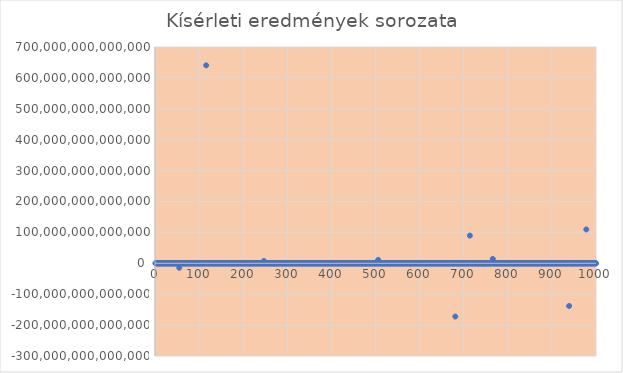
| Category | Series 0 |
|---|---|
| 1.0 | 73.342 |
| 2.0 | -17996149.542 |
| 3.0 | -966.237 |
| 4.0 | 42.602 |
| 5.0 | -108.548 |
| 6.0 | 33.973 |
| 7.0 | 140.555 |
| 8.0 | 71.246 |
| 9.0 | 44.869 |
| 10.0 | -35.589 |
| 11.0 | 1286.408 |
| 12.0 | 18496.876 |
| 13.0 | -331.157 |
| 14.0 | 5827.987 |
| 15.0 | 65.368 |
| 16.0 | -37.232 |
| 17.0 | 1768.149 |
| 18.0 | -10679392.451 |
| 19.0 | -5120.488 |
| 20.0 | 27354.216 |
| 21.0 | 3478.689 |
| 22.0 | -87.355 |
| 23.0 | -886.27 |
| 24.0 | -161.685 |
| 25.0 | 848.613 |
| 26.0 | 1270.61 |
| 27.0 | 44881.534 |
| 28.0 | 4924587.61 |
| 29.0 | 2750.919 |
| 30.0 | 37.906 |
| 31.0 | 869.395 |
| 32.0 | 513.963 |
| 33.0 | 309.55 |
| 34.0 | -81.606 |
| 35.0 | 9702.575 |
| 36.0 | 163.185 |
| 37.0 | 138.92 |
| 38.0 | -109.573 |
| 39.0 | 189.005 |
| 40.0 | 270.432 |
| 41.0 | -24876.986 |
| 42.0 | 24616.83 |
| 43.0 | 837.909 |
| 44.0 | -8648.032 |
| 45.0 | 1144230.685 |
| 46.0 | -347.863 |
| 47.0 | 3090.808 |
| 48.0 | 214.152 |
| 49.0 | -46.466 |
| 50.0 | 80198.546 |
| 51.0 | -2516649.224 |
| 52.0 | 262.194 |
| 53.0 | -143.619 |
| 54.0 | 260241145.39 |
| 55.0 | -14431486044279.479 |
| 56.0 | -308.086 |
| 57.0 | 2652790.462 |
| 58.0 | 56.416 |
| 59.0 | -49.711 |
| 60.0 | -439168.383 |
| 61.0 | 50229682.8 |
| 62.0 | -1007.143 |
| 63.0 | 278.02 |
| 64.0 | -41.912 |
| 65.0 | -34.911 |
| 66.0 | 281.714 |
| 67.0 | -2992721.788 |
| 68.0 | 19943122.994 |
| 69.0 | 1862.715 |
| 70.0 | -30557883.159 |
| 71.0 | -285.785 |
| 72.0 | 80.2 |
| 73.0 | -281.105 |
| 74.0 | -6490377.122 |
| 75.0 | 85.942 |
| 76.0 | -34.831 |
| 77.0 | 82.669 |
| 78.0 | -471415.258 |
| 79.0 | -485.772 |
| 80.0 | -75.779 |
| 81.0 | 44.763 |
| 82.0 | 271.97 |
| 83.0 | 44.031 |
| 84.0 | 72.902 |
| 85.0 | 56.182 |
| 86.0 | 238.183 |
| 87.0 | 2654.905 |
| 88.0 | 541023584.416 |
| 89.0 | 4011.777 |
| 90.0 | 3287.217 |
| 91.0 | -76.927 |
| 92.0 | -2416.525 |
| 93.0 | -80.453 |
| 94.0 | -30752041523.714 |
| 95.0 | -161.123 |
| 96.0 | -5057.578 |
| 97.0 | 56.502 |
| 98.0 | 227.156 |
| 99.0 | 4633.715 |
| 100.0 | -37.372 |
| 101.0 | 8231.867 |
| 102.0 | 100.859 |
| 103.0 | -100.55 |
| 104.0 | -69.773 |
| 105.0 | 128.622 |
| 106.0 | 298.721 |
| 107.0 | -10896.854 |
| 108.0 | 52.406 |
| 109.0 | -1121071.77 |
| 110.0 | 2136.982 |
| 111.0 | 151.973 |
| 112.0 | 3505.059 |
| 113.0 | -1383.465 |
| 114.0 | 3063.042 |
| 115.0 | -393.62 |
| 116.0 | 640627543377328 |
| 117.0 | 103.512 |
| 118.0 | 76179.574 |
| 119.0 | -6822.979 |
| 120.0 | -8134.371 |
| 121.0 | -402.621 |
| 122.0 | -112.778 |
| 123.0 | 476.123 |
| 124.0 | 16363.887 |
| 125.0 | 38.317 |
| 126.0 | 163.785 |
| 127.0 | -189543862.73 |
| 128.0 | -2467.603 |
| 129.0 | 45584441.06 |
| 130.0 | 10785528.859 |
| 131.0 | 81.131 |
| 132.0 | 4861.504 |
| 133.0 | -250.971 |
| 134.0 | -51.993 |
| 135.0 | 3661.877 |
| 136.0 | -71.236 |
| 137.0 | -40.481 |
| 138.0 | -36.744 |
| 139.0 | -3455.019 |
| 140.0 | -222.64 |
| 141.0 | 2890.851 |
| 142.0 | -405.697 |
| 143.0 | -121.586 |
| 144.0 | 242.682 |
| 145.0 | -1328.019 |
| 146.0 | -280.11 |
| 147.0 | -82.692 |
| 148.0 | -926.724 |
| 149.0 | -59200.779 |
| 150.0 | -300.909 |
| 151.0 | -167.935 |
| 152.0 | -59.829 |
| 153.0 | -52439.577 |
| 154.0 | 1104392375.133 |
| 155.0 | 314.073 |
| 156.0 | 134.134 |
| 157.0 | -57572.172 |
| 158.0 | 8915.127 |
| 159.0 | 365.458 |
| 160.0 | 8901787220.074 |
| 161.0 | 5249.746 |
| 162.0 | -3840581.279 |
| 163.0 | 10339.925 |
| 164.0 | 661053.043 |
| 165.0 | 143.523 |
| 166.0 | -1250.241 |
| 167.0 | -482873.193 |
| 168.0 | 206962.192 |
| 169.0 | -5255.699 |
| 170.0 | -86.529 |
| 171.0 | -9542.311 |
| 172.0 | -72.633 |
| 173.0 | -53.033 |
| 174.0 | -444.978 |
| 175.0 | -1029.157 |
| 176.0 | 3226.575 |
| 177.0 | 57.982 |
| 178.0 | -448809.011 |
| 179.0 | -227.37 |
| 180.0 | -36223.986 |
| 181.0 | -747.569 |
| 182.0 | 1432.853 |
| 183.0 | -141.299 |
| 184.0 | 1355.49 |
| 185.0 | 178.815 |
| 186.0 | 678.6 |
| 187.0 | -1172.414 |
| 188.0 | 204.514 |
| 189.0 | 9041.214 |
| 190.0 | 42.049 |
| 191.0 | -2086514.202 |
| 192.0 | -126.004 |
| 193.0 | -2313.162 |
| 194.0 | 9747.644 |
| 195.0 | 34629.537 |
| 196.0 | -9517.489 |
| 197.0 | 162.893 |
| 198.0 | 1601.783 |
| 199.0 | 71.234 |
| 200.0 | -689953270.702 |
| 201.0 | -656781.119 |
| 202.0 | 366.396 |
| 203.0 | -11156550.44 |
| 204.0 | 1917033.473 |
| 205.0 | 548.991 |
| 206.0 | 2677.411 |
| 207.0 | 3662885.429 |
| 208.0 | 86.956 |
| 209.0 | -290.854 |
| 210.0 | -234.71 |
| 211.0 | 4629.542 |
| 212.0 | 84.204 |
| 213.0 | 68565.838 |
| 214.0 | 5913402.007 |
| 215.0 | -55.258 |
| 216.0 | 151092.17 |
| 217.0 | 746836625.685 |
| 218.0 | 481.399 |
| 219.0 | 96.106 |
| 220.0 | 2865.622 |
| 221.0 | 980073.94 |
| 222.0 | -63.208 |
| 223.0 | -41.245 |
| 224.0 | -505649.778 |
| 225.0 | 40.508 |
| 226.0 | -16393.477 |
| 227.0 | -8470.802 |
| 228.0 | -5826.84 |
| 229.0 | 3730.81 |
| 230.0 | 154011.578 |
| 231.0 | 456.167 |
| 232.0 | 118116.767 |
| 233.0 | -125.825 |
| 234.0 | -47.247 |
| 235.0 | -2789.272 |
| 236.0 | -1183.311 |
| 237.0 | 32.6 |
| 238.0 | -1221.182 |
| 239.0 | 17007.761 |
| 240.0 | -170.354 |
| 241.0 | -1064756.291 |
| 242.0 | 39781.226 |
| 243.0 | 23241.488 |
| 244.0 | -246620.998 |
| 245.0 | -9286.364 |
| 246.0 | 92.542 |
| 247.0 | 7321890324516.183 |
| 248.0 | -52.753 |
| 249.0 | 16693.771 |
| 250.0 | -75.807 |
| 251.0 | -5344550.274 |
| 252.0 | 4497.48 |
| 253.0 | -45702.631 |
| 254.0 | 77.741 |
| 255.0 | 201.842 |
| 256.0 | -58.489 |
| 257.0 | 2025224.752 |
| 258.0 | 36.952 |
| 259.0 | -8553.124 |
| 260.0 | -17834954.621 |
| 261.0 | 50.321 |
| 262.0 | -32.022 |
| 263.0 | -221.034 |
| 264.0 | -237.082 |
| 265.0 | 270.208 |
| 266.0 | -21566.275 |
| 267.0 | 53.302 |
| 268.0 | 64986.665 |
| 269.0 | 580714.782 |
| 270.0 | -178.048 |
| 271.0 | 172.127 |
| 272.0 | 4222.829 |
| 273.0 | -670.483 |
| 274.0 | 718652.392 |
| 275.0 | -5544.128 |
| 276.0 | -501.279 |
| 277.0 | -2023.413 |
| 278.0 | 339.611 |
| 279.0 | 7851.961 |
| 280.0 | 158.269 |
| 281.0 | 257931.862 |
| 282.0 | 78145692.449 |
| 283.0 | 524.137 |
| 284.0 | -93.564 |
| 285.0 | -125.654 |
| 286.0 | 35966.59 |
| 287.0 | 3871.192 |
| 288.0 | -46717853.097 |
| 289.0 | -277942.065 |
| 290.0 | 99.932 |
| 291.0 | 367.872 |
| 292.0 | 121.573 |
| 293.0 | -44.832 |
| 294.0 | -720676.879 |
| 295.0 | -4200485505.864 |
| 296.0 | 96483.128 |
| 297.0 | 27230.88 |
| 298.0 | 146.956 |
| 299.0 | -27335.293 |
| 300.0 | -43.591 |
| 301.0 | -19797007.155 |
| 302.0 | 18452107752.342 |
| 303.0 | -50067.994 |
| 304.0 | -217715.306 |
| 305.0 | -13539860.678 |
| 306.0 | -26088.23 |
| 307.0 | -720448.118 |
| 308.0 | 4659.966 |
| 309.0 | -1938.896 |
| 310.0 | 1923.173 |
| 311.0 | -598.794 |
| 312.0 | -938632.234 |
| 313.0 | 579.905 |
| 314.0 | 3629.031 |
| 315.0 | 43.281 |
| 316.0 | 726.743 |
| 317.0 | 35.801 |
| 318.0 | 36.755 |
| 319.0 | 2137.408 |
| 320.0 | 244.26 |
| 321.0 | -37.345 |
| 322.0 | -18226978.666 |
| 323.0 | -890889.2 |
| 324.0 | -145.328 |
| 325.0 | -343.305 |
| 326.0 | -37191.588 |
| 327.0 | 599.649 |
| 328.0 | 267.562 |
| 329.0 | -27059278.865 |
| 330.0 | -1062.413 |
| 331.0 | -44.245 |
| 332.0 | 526.221 |
| 333.0 | -38.887 |
| 334.0 | 485064976.823 |
| 335.0 | 80.446 |
| 336.0 | 155.543 |
| 337.0 | 1066830.922 |
| 338.0 | -144.643 |
| 339.0 | 350990.414 |
| 340.0 | -50.384 |
| 341.0 | 15159.903 |
| 342.0 | -177.815 |
| 343.0 | 913.83 |
| 344.0 | -2082.379 |
| 345.0 | -3680.786 |
| 346.0 | -7317.656 |
| 347.0 | -360.324 |
| 348.0 | 163.406 |
| 349.0 | -11866501738.89 |
| 350.0 | -10546.822 |
| 351.0 | -218658.261 |
| 352.0 | -75938.696 |
| 353.0 | -112.43 |
| 354.0 | 853.333 |
| 355.0 | -215.975 |
| 356.0 | 90634.556 |
| 357.0 | 89.451 |
| 358.0 | 60.604 |
| 359.0 | -38.192 |
| 360.0 | -102.214 |
| 361.0 | -5855.637 |
| 362.0 | 507.905 |
| 363.0 | 2649930.286 |
| 364.0 | 45.924 |
| 365.0 | -997621.627 |
| 366.0 | -158.505 |
| 367.0 | -87.138 |
| 368.0 | 1562.125 |
| 369.0 | 45.516 |
| 370.0 | 102.393 |
| 371.0 | 100023.058 |
| 372.0 | 58.333 |
| 373.0 | 145.272 |
| 374.0 | -61.465 |
| 375.0 | -48.147 |
| 376.0 | -141.571 |
| 377.0 | -48.403 |
| 378.0 | 1296.972 |
| 379.0 | -36036.881 |
| 380.0 | -4522219858.998 |
| 381.0 | -202.15 |
| 382.0 | 64.849 |
| 383.0 | 259.17 |
| 384.0 | 6297.372 |
| 385.0 | 2166142.5 |
| 386.0 | 265.285 |
| 387.0 | -24636.835 |
| 388.0 | 35630.222 |
| 389.0 | 222.437 |
| 390.0 | -1851438292.935 |
| 391.0 | -220349381.201 |
| 392.0 | 51.701 |
| 393.0 | -42909.183 |
| 394.0 | 650.252 |
| 395.0 | 759416.786 |
| 396.0 | -5504246.168 |
| 397.0 | -80.794 |
| 398.0 | -6425.819 |
| 399.0 | -44.185 |
| 400.0 | 83.713 |
| 401.0 | -45.234 |
| 402.0 | -379114.582 |
| 403.0 | 1728.827 |
| 404.0 | -338.439 |
| 405.0 | 63118688.457 |
| 406.0 | -77.933 |
| 407.0 | -185.575 |
| 408.0 | -13040.842 |
| 409.0 | -24130.278 |
| 410.0 | -1052499.258 |
| 411.0 | -1052.744 |
| 412.0 | -40.822 |
| 413.0 | -7187.272 |
| 414.0 | 179665243956.348 |
| 415.0 | -308.33 |
| 416.0 | 2789.341 |
| 417.0 | 40580.725 |
| 418.0 | -612.431 |
| 419.0 | 275.492 |
| 420.0 | 1160749.858 |
| 421.0 | 26496.736 |
| 422.0 | 348.906 |
| 423.0 | -8694.319 |
| 424.0 | -480.273 |
| 425.0 | -43.535 |
| 426.0 | 61.683 |
| 427.0 | -7010.892 |
| 428.0 | -82604.616 |
| 429.0 | -135.222 |
| 430.0 | -8096.954 |
| 431.0 | -387.003 |
| 432.0 | 3199.681 |
| 433.0 | -209.767 |
| 434.0 | -389347665.443 |
| 435.0 | 93.447 |
| 436.0 | 7599.342 |
| 437.0 | 280284.227 |
| 438.0 | 50.037 |
| 439.0 | 848.691 |
| 440.0 | 159.005 |
| 441.0 | -97641.105 |
| 442.0 | 17395.268 |
| 443.0 | -257031.594 |
| 444.0 | 186.737 |
| 445.0 | -10009.223 |
| 446.0 | 14976.923 |
| 447.0 | -6765.273 |
| 448.0 | -960.723 |
| 449.0 | 837.363 |
| 450.0 | -16307826.051 |
| 451.0 | 51.385 |
| 452.0 | 1527.069 |
| 453.0 | -411.883 |
| 454.0 | 760647.999 |
| 455.0 | -14532.736 |
| 456.0 | -262.52 |
| 457.0 | -130.116 |
| 458.0 | 142.748 |
| 459.0 | -248.293 |
| 460.0 | 637838.877 |
| 461.0 | -275.856 |
| 462.0 | -171.347 |
| 463.0 | -1166.597 |
| 464.0 | 1703571.217 |
| 465.0 | -7280.77 |
| 466.0 | 692758.69 |
| 467.0 | -78672.543 |
| 468.0 | 1930.393 |
| 469.0 | -1749.125 |
| 470.0 | 277324.214 |
| 471.0 | -51.505 |
| 472.0 | 4054.788 |
| 473.0 | 264.261 |
| 474.0 | 5505.796 |
| 475.0 | -66588.209 |
| 476.0 | -98.661 |
| 477.0 | -5723.341 |
| 478.0 | 158527.933 |
| 479.0 | 82711.745 |
| 480.0 | -1877.235 |
| 481.0 | 60.56 |
| 482.0 | -185187.359 |
| 483.0 | -46.713 |
| 484.0 | -53.77 |
| 485.0 | 480.706 |
| 486.0 | -1468.65 |
| 487.0 | 287.642 |
| 488.0 | 865571938.265 |
| 489.0 | -86.978 |
| 490.0 | -1693.075 |
| 491.0 | 64917.646 |
| 492.0 | 82.604 |
| 493.0 | 801.901 |
| 494.0 | 399.96 |
| 495.0 | -578.423 |
| 496.0 | 103.314 |
| 497.0 | 164.606 |
| 498.0 | 63.004 |
| 499.0 | -315.547 |
| 500.0 | 223.29 |
| 501.0 | 7793.998 |
| 502.0 | 15556643615.918 |
| 503.0 | 155.28 |
| 504.0 | 2157.731 |
| 505.0 | -63.095 |
| 506.0 | 10934988574339.445 |
| 507.0 | 58.055 |
| 508.0 | -6693.367 |
| 509.0 | -2248.327 |
| 510.0 | -486.166 |
| 511.0 | 7595.785 |
| 512.0 | 54.58 |
| 513.0 | 35355.437 |
| 514.0 | -58.041 |
| 515.0 | -383.093 |
| 516.0 | 3057.688 |
| 517.0 | -155.487 |
| 518.0 | -79.359 |
| 519.0 | 170.645 |
| 520.0 | -2425.36 |
| 521.0 | 86.668 |
| 522.0 | 76.417 |
| 523.0 | -39.855 |
| 524.0 | 134.973 |
| 525.0 | 5180545.258 |
| 526.0 | -201.868 |
| 527.0 | -40.272 |
| 528.0 | -1075.208 |
| 529.0 | 45771.595 |
| 530.0 | -890.983 |
| 531.0 | 1081.718 |
| 532.0 | -591.87 |
| 533.0 | -645.55 |
| 534.0 | 44.98 |
| 535.0 | 588370.78 |
| 536.0 | -38740.618 |
| 537.0 | 321.935 |
| 538.0 | -7730026.896 |
| 539.0 | -69.266 |
| 540.0 | -455.688 |
| 541.0 | -584.805 |
| 542.0 | 1658.486 |
| 543.0 | -14354.846 |
| 544.0 | -451.502 |
| 545.0 | 79642.834 |
| 546.0 | 1937.033 |
| 547.0 | 59162.077 |
| 548.0 | -663.422 |
| 549.0 | -430.659 |
| 550.0 | 149.422 |
| 551.0 | 1038.283 |
| 552.0 | -73.708 |
| 553.0 | -200.607 |
| 554.0 | 72.006 |
| 555.0 | -698.377 |
| 556.0 | -39.007 |
| 557.0 | -241.659 |
| 558.0 | 241.145 |
| 559.0 | 208.52 |
| 560.0 | 35.812 |
| 561.0 | 443.69 |
| 562.0 | 488.243 |
| 563.0 | 563562.442 |
| 564.0 | -208.827 |
| 565.0 | -178.538 |
| 566.0 | -918.03 |
| 567.0 | -5417.101 |
| 568.0 | -2241.676 |
| 569.0 | -1429.808 |
| 570.0 | -14989.533 |
| 571.0 | 44.888 |
| 572.0 | -2790.483 |
| 573.0 | -807.208 |
| 574.0 | 388.425 |
| 575.0 | 32.845 |
| 576.0 | -62524710.505 |
| 577.0 | 118.191 |
| 578.0 | -13597835.762 |
| 579.0 | -203.926 |
| 580.0 | 62.363 |
| 581.0 | -14726551.56 |
| 582.0 | 605.349 |
| 583.0 | -103250.963 |
| 584.0 | 38311.768 |
| 585.0 | 1298191609.23 |
| 586.0 | 5749.528 |
| 587.0 | 198.058 |
| 588.0 | -38.836 |
| 589.0 | -2581.3 |
| 590.0 | -62.078 |
| 591.0 | 25272314.052 |
| 592.0 | -33267610.334 |
| 593.0 | -120144616882.459 |
| 594.0 | 4517.589 |
| 595.0 | -1158.495 |
| 596.0 | -60776.586 |
| 597.0 | -64121.437 |
| 598.0 | -32495.163 |
| 599.0 | -84.196 |
| 600.0 | -267.281 |
| 601.0 | -30024.64 |
| 602.0 | -15706.16 |
| 603.0 | 196.513 |
| 604.0 | 6538.207 |
| 605.0 | 834620.65 |
| 606.0 | -432.733 |
| 607.0 | 4979.065 |
| 608.0 | -39.848 |
| 609.0 | -606.674 |
| 610.0 | -15337231.544 |
| 611.0 | 372767.795 |
| 612.0 | -92744.091 |
| 613.0 | -1568.492 |
| 614.0 | -127.37 |
| 615.0 | -137338.46 |
| 616.0 | 1290.354 |
| 617.0 | -91.404 |
| 618.0 | 98140.901 |
| 619.0 | 10698.94 |
| 620.0 | -240549.874 |
| 621.0 | -1867.075 |
| 622.0 | 1999.344 |
| 623.0 | 320.959 |
| 624.0 | -204.828 |
| 625.0 | -130.912 |
| 626.0 | -6286780.121 |
| 627.0 | -72.732 |
| 628.0 | -57602742.298 |
| 629.0 | -61831633.913 |
| 630.0 | 935.888 |
| 631.0 | -145.695 |
| 632.0 | 66.683 |
| 633.0 | 374.974 |
| 634.0 | -3273.881 |
| 635.0 | 785.933 |
| 636.0 | 825836.431 |
| 637.0 | -5834.217 |
| 638.0 | 106.154 |
| 639.0 | -1243.785 |
| 640.0 | -5077.17 |
| 641.0 | 68.541 |
| 642.0 | 23867.862 |
| 643.0 | -79.281 |
| 644.0 | -86090.421 |
| 645.0 | -35.538 |
| 646.0 | 3101.658 |
| 647.0 | -446.994 |
| 648.0 | -298.493 |
| 649.0 | -38.551 |
| 650.0 | -225750.829 |
| 651.0 | 103470.587 |
| 652.0 | 36.344 |
| 653.0 | -320.226 |
| 654.0 | 55.209 |
| 655.0 | 273906.536 |
| 656.0 | -24147.732 |
| 657.0 | -111.444 |
| 658.0 | -88334.25 |
| 659.0 | 112.074 |
| 660.0 | -43933.524 |
| 661.0 | -4246743.208 |
| 662.0 | -96.956 |
| 663.0 | -117.961 |
| 664.0 | -5101.088 |
| 665.0 | 1042.559 |
| 666.0 | -767.59 |
| 667.0 | -168.941 |
| 668.0 | -39.324 |
| 669.0 | 159.605 |
| 670.0 | -1593.954 |
| 671.0 | 27695360411.558 |
| 672.0 | 197.85 |
| 673.0 | -634247.858 |
| 674.0 | 186.891 |
| 675.0 | 3207.461 |
| 676.0 | -685.234 |
| 677.0 | -2600.956 |
| 678.0 | -231209.306 |
| 679.0 | 42.602 |
| 680.0 | -55.927 |
| 681.0 | -172259521509060.22 |
| 682.0 | -210424.831 |
| 683.0 | -2238.703 |
| 684.0 | 130128109.416 |
| 685.0 | 8628.222 |
| 686.0 | 43550.284 |
| 687.0 | 1810.32 |
| 688.0 | -805.023 |
| 689.0 | -4764.807 |
| 690.0 | -38.204 |
| 691.0 | -1404.586 |
| 692.0 | -175.931 |
| 693.0 | 207140.593 |
| 694.0 | 126905.459 |
| 695.0 | 3293.903 |
| 696.0 | -884.353 |
| 697.0 | -306868.819 |
| 698.0 | -2260583.077 |
| 699.0 | 32949.438 |
| 700.0 | 36.066 |
| 701.0 | 12789685141.041 |
| 702.0 | -57.082 |
| 703.0 | -55.705 |
| 704.0 | 5067.006 |
| 705.0 | -51.26 |
| 706.0 | -210.754 |
| 707.0 | -140.171 |
| 708.0 | 9415.252 |
| 709.0 | -2987.232 |
| 710.0 | 3487.215 |
| 711.0 | 14032.915 |
| 712.0 | 1519337353.917 |
| 713.0 | -10662415.187 |
| 714.0 | 89668289436879.31 |
| 715.0 | -63.614 |
| 716.0 | -66.155 |
| 717.0 | -521.893 |
| 718.0 | -7441.115 |
| 719.0 | 120726.376 |
| 720.0 | -398.007 |
| 721.0 | -36.762 |
| 722.0 | 205.337 |
| 723.0 | 62.281 |
| 724.0 | -208.411 |
| 725.0 | 518.902 |
| 726.0 | 606.171 |
| 727.0 | 1687.068 |
| 728.0 | -42.82 |
| 729.0 | -12356.941 |
| 730.0 | -144190311.774 |
| 731.0 | 191.504 |
| 732.0 | -283.497 |
| 733.0 | -51685.53 |
| 734.0 | 37569.387 |
| 735.0 | 304.993 |
| 736.0 | -278.996 |
| 737.0 | 28228.429 |
| 738.0 | 341.313 |
| 739.0 | 1169.669 |
| 740.0 | -6599.384 |
| 741.0 | 97.517 |
| 742.0 | -81201206.38 |
| 743.0 | -40.182 |
| 744.0 | 71041.335 |
| 745.0 | -899429124132.001 |
| 746.0 | -407948.416 |
| 747.0 | -167.217 |
| 748.0 | 200.051 |
| 749.0 | 49.725 |
| 750.0 | 66.162 |
| 751.0 | -12671.984 |
| 752.0 | 386.811 |
| 753.0 | -67.374 |
| 754.0 | -1554.004 |
| 755.0 | -2985.959 |
| 756.0 | 136.387 |
| 757.0 | -549.099 |
| 758.0 | -1346.663 |
| 759.0 | 30134.302 |
| 760.0 | 53.746 |
| 761.0 | 511.752 |
| 762.0 | -45.164 |
| 763.0 | 4828.665 |
| 764.0 | -6943.96 |
| 765.0 | 5815.954 |
| 766.0 | 14037037781836.947 |
| 767.0 | -33.039 |
| 768.0 | -620 |
| 769.0 | -394.191 |
| 770.0 | 138.301 |
| 771.0 | -5885.094 |
| 772.0 | -1775.974 |
| 773.0 | -157.718 |
| 774.0 | 25617.729 |
| 775.0 | 119.443 |
| 776.0 | -1878.897 |
| 777.0 | 74.455 |
| 778.0 | 4618.677 |
| 779.0 | 142182.208 |
| 780.0 | -40.675 |
| 781.0 | -2175.361 |
| 782.0 | -164409.374 |
| 783.0 | -4516171.216 |
| 784.0 | 4144.688 |
| 785.0 | -236.963 |
| 786.0 | -1559.595 |
| 787.0 | -1664.648 |
| 788.0 | -236.131 |
| 789.0 | -15748.09 |
| 790.0 | 4563.123 |
| 791.0 | 13080.834 |
| 792.0 | -518636.059 |
| 793.0 | 320950.977 |
| 794.0 | -75094073.306 |
| 795.0 | 299.917 |
| 796.0 | 12660028.223 |
| 797.0 | -404374.626 |
| 798.0 | 3053.876 |
| 799.0 | -92.556 |
| 800.0 | -2919.766 |
| 801.0 | 49007543.479 |
| 802.0 | -22425.039 |
| 803.0 | 44.11 |
| 804.0 | -72.942 |
| 805.0 | 49.569 |
| 806.0 | 141858200.531 |
| 807.0 | 64.006 |
| 808.0 | -160.071 |
| 809.0 | 19459186.139 |
| 810.0 | 462.499 |
| 811.0 | 47.512 |
| 812.0 | 1030.769 |
| 813.0 | -71.023 |
| 814.0 | -56.614 |
| 815.0 | 7061.54 |
| 816.0 | -1803.247 |
| 817.0 | 7712.457 |
| 818.0 | -362.95 |
| 819.0 | -273.506 |
| 820.0 | 232.446 |
| 821.0 | -512.263 |
| 822.0 | -527.299 |
| 823.0 | 119.129 |
| 824.0 | 38.122 |
| 825.0 | -16629.033 |
| 826.0 | -811.805 |
| 827.0 | -374.502 |
| 828.0 | 9269.413 |
| 829.0 | 124.906 |
| 830.0 | 1427.729 |
| 831.0 | -6594.505 |
| 832.0 | 15825.73 |
| 833.0 | 396365.412 |
| 834.0 | 11818740.158 |
| 835.0 | -1225.104 |
| 836.0 | -50.811 |
| 837.0 | -36.824 |
| 838.0 | -64.294 |
| 839.0 | -137.662 |
| 840.0 | -832.708 |
| 841.0 | -194.723 |
| 842.0 | -55.036 |
| 843.0 | 93.591 |
| 844.0 | -20187148.879 |
| 845.0 | -2587286830.249 |
| 846.0 | -96.799 |
| 847.0 | 375.387 |
| 848.0 | -32.317 |
| 849.0 | -137.266 |
| 850.0 | 169.652 |
| 851.0 | 4371.688 |
| 852.0 | -43.367 |
| 853.0 | -746230.11 |
| 854.0 | -52.633 |
| 855.0 | 288.923 |
| 856.0 | -3714.346 |
| 857.0 | -225048.257 |
| 858.0 | -656.653 |
| 859.0 | 933385.418 |
| 860.0 | 15896.881 |
| 861.0 | 662.655 |
| 862.0 | 7369920.484 |
| 863.0 | 1221.587 |
| 864.0 | -46.474 |
| 865.0 | -4261.337 |
| 866.0 | 48.197 |
| 867.0 | -14694.721 |
| 868.0 | 829.658 |
| 869.0 | 86391.209 |
| 870.0 | 801733.014 |
| 871.0 | 742248165.707 |
| 872.0 | -185198400.654 |
| 873.0 | 31953.379 |
| 874.0 | -6799650.758 |
| 875.0 | 599.168 |
| 876.0 | 112.46 |
| 877.0 | 83.113 |
| 878.0 | -42.234 |
| 879.0 | -13242943.705 |
| 880.0 | -508.358 |
| 881.0 | -901.694 |
| 882.0 | 2223.16 |
| 883.0 | -774.405 |
| 884.0 | 13900.477 |
| 885.0 | 28688.386 |
| 886.0 | -1160230.16 |
| 887.0 | -162649.354 |
| 888.0 | 71.717 |
| 889.0 | -440.455 |
| 890.0 | -31474.578 |
| 891.0 | 1129789.269 |
| 892.0 | -6389.296 |
| 893.0 | -41.25 |
| 894.0 | -248.264 |
| 895.0 | -491.656 |
| 896.0 | 75778254.316 |
| 897.0 | -1667807.335 |
| 898.0 | 76.5 |
| 899.0 | 459743.89 |
| 900.0 | -1841825.416 |
| 901.0 | -657.903 |
| 902.0 | -40.513 |
| 903.0 | 40.517 |
| 904.0 | -8803.857 |
| 905.0 | -1532.524 |
| 906.0 | -1973.208 |
| 907.0 | -523.411 |
| 908.0 | -217.243 |
| 909.0 | -76.711 |
| 910.0 | 24748478.212 |
| 911.0 | 2672054.585 |
| 912.0 | 41.578 |
| 913.0 | -97.568 |
| 914.0 | 44.405 |
| 915.0 | -2207.222 |
| 916.0 | -173.635 |
| 917.0 | 386.935 |
| 918.0 | 10264.812 |
| 919.0 | -66.803 |
| 920.0 | -645.937 |
| 921.0 | -4203542.862 |
| 922.0 | -2964.885 |
| 923.0 | 619107.361 |
| 924.0 | 67.628 |
| 925.0 | 51.344 |
| 926.0 | -11061.493 |
| 927.0 | 19990.015 |
| 928.0 | -124.08 |
| 929.0 | 75156.599 |
| 930.0 | -5628673.6 |
| 931.0 | 36.931 |
| 932.0 | -22043.205 |
| 933.0 | 9015.836 |
| 934.0 | 1207.81 |
| 935.0 | -149890649.96 |
| 936.0 | -3492.852 |
| 937.0 | 23037.384 |
| 938.0 | 32.626 |
| 939.0 | -138148051573553.98 |
| 940.0 | -85142.276 |
| 941.0 | 161.962 |
| 942.0 | -181.554 |
| 943.0 | 5000.535 |
| 944.0 | -90.145 |
| 945.0 | -374934661927.805 |
| 946.0 | 6777.621 |
| 947.0 | -89.736 |
| 948.0 | -1238.597 |
| 949.0 | 8261.307 |
| 950.0 | -251.831 |
| 951.0 | -316525.012 |
| 952.0 | -161.806 |
| 953.0 | -40.239 |
| 954.0 | -73.358 |
| 955.0 | -14721.974 |
| 956.0 | 5965.286 |
| 957.0 | 3447.604 |
| 958.0 | -498.366 |
| 959.0 | -178.668 |
| 960.0 | 75391959.848 |
| 961.0 | 46.545 |
| 962.0 | 49714.805 |
| 963.0 | 4893402.617 |
| 964.0 | -1962.823 |
| 965.0 | -85631.66 |
| 966.0 | -197017.015 |
| 967.0 | -229378.611 |
| 968.0 | 44032.439 |
| 969.0 | 53.499 |
| 970.0 | -585472.349 |
| 971.0 | -3198.64 |
| 972.0 | 6669.559 |
| 973.0 | -181.808 |
| 974.0 | 145986760118.759 |
| 975.0 | -6935.3 |
| 976.0 | -9574.291 |
| 977.0 | -373.474 |
| 978.0 | 109558076940592.98 |
| 979.0 | -51.25 |
| 980.0 | 22167330.504 |
| 981.0 | 103.988 |
| 982.0 | -228.39 |
| 983.0 | -39345527.272 |
| 984.0 | -367.406 |
| 985.0 | 1260618587047.398 |
| 986.0 | -35.959 |
| 987.0 | 14881932.975 |
| 988.0 | 8776.148 |
| 989.0 | -153.557 |
| 990.0 | 2354.758 |
| 991.0 | 4821.934 |
| 992.0 | -7294.204 |
| 993.0 | -44.923 |
| 994.0 | -64.347 |
| 995.0 | -61.614 |
| 996.0 | 366245.85 |
| 997.0 | 314.168 |
| 998.0 | -2350.335 |
| 999.0 | -84.564 |
| 1000.0 | -1385.176 |